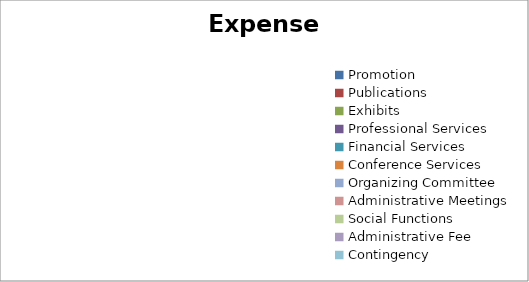
| Category | Expenses |
|---|---|
| Promotion | 0 |
| Publications | 0 |
| Exhibits | 0 |
| Professional Services | 0 |
| Financial Services | 0 |
| Conference Services | 0 |
| Organizing Committee | 0 |
| Administrative Meetings | 0 |
| Social Functions | 0 |
| Administrative Fee | 0 |
| Contingency | 0 |